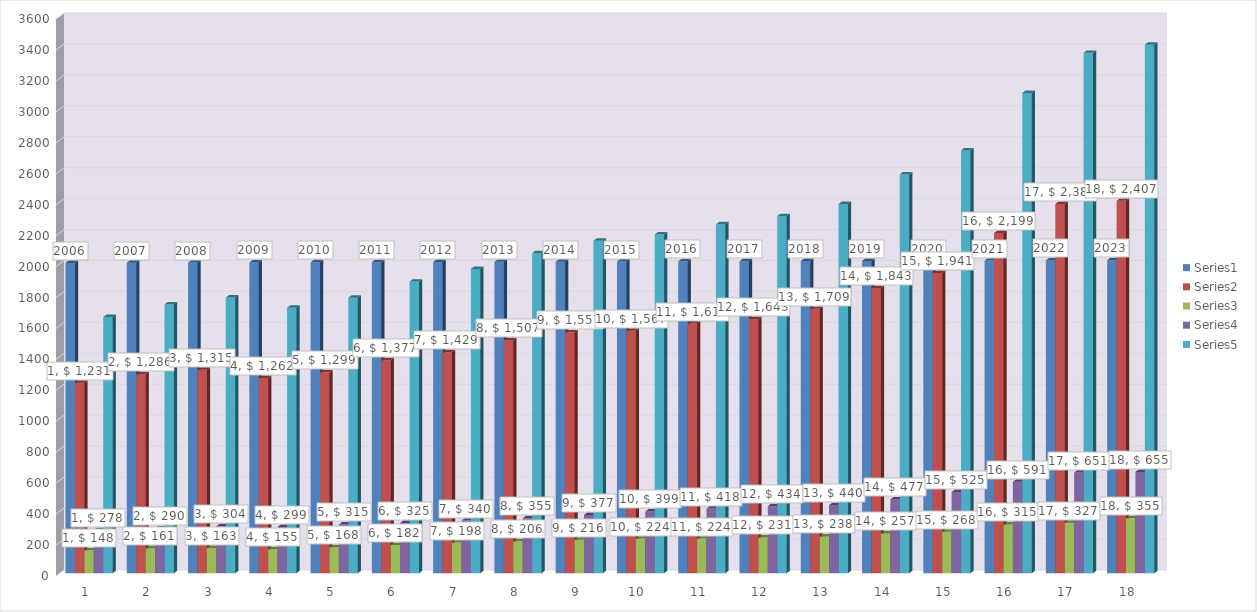
| Category | Series 0 | Series 1 | Series 2 | Series 3 | Series 4 |
|---|---|---|---|---|---|
| 0 | 2006 | 1231 | 148 | 278 | 1656 |
| 1 | 2007 | 1286 | 161 | 290 | 1737 |
| 2 | 2008 | 1315 | 163 | 304 | 1782 |
| 3 | 2009 | 1262 | 155 | 299 | 1716 |
| 4 | 2010 | 1299 | 168 | 315 | 1781 |
| 5 | 2011 | 1377 | 182 | 325 | 1885 |
| 6 | 2012 | 1429 | 198 | 340 | 1967 |
| 7 | 2013 | 1507 | 206 | 355 | 2068 |
| 8 | 2014 | 1557 | 216 | 377 | 2149 |
| 9 | 2015 | 1567 | 224 | 399 | 2190 |
| 10 | 2016 | 1614 | 224 | 418 | 2256 |
| 11 | 2017 | 1643 | 231 | 434 | 2308 |
| 12 | 2018 | 1709 | 238 | 440 | 2387 |
| 13 | 2019 | 1843 | 257 | 477 | 2578 |
| 14 | 2020 | 1941 | 268 | 525 | 2733 |
| 15 | 2021 | 2199 | 315 | 591 | 3105 |
| 16 | 2022 | 2387 | 327 | 651 | 3364 |
| 17 | 2023 | 2407 | 355 | 655 | 3417 |